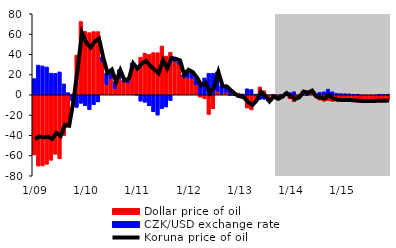
| Category | Dollar price of oil | CZK/USD exchange rate |
|---|---|---|
|  1/09 | -59.391 | 16.006 |
| 2 | -70.357 | 29.347 |
| 3 | -70.222 | 28.538 |
| 4 | -68.665 | 27.498 |
| 5 | -64.642 | 21.394 |
| 6 | -58.663 | 21.136 |
| 7 | -63.169 | 22.603 |
| 8 | -40.23 | 10.781 |
| 9 | -32.348 | 2.13 |
| 10 | 0.767 | -6.15 |
| 11 | 39.139 | -12.428 |
| 12 | 72.41 | -8.414 |
|  1/10 | 62.647 | -10.819 |
| 2 | 61.389 | -14.734 |
| 3 | 62.405 | -9.884 |
| 4 | 62.436 | -6.995 |
| 5 | 32.996 | 4.415 |
| 6 | 10.111 | 11.518 |
| 7 | 16.375 | 8.178 |
| 8 | 6.184 | 7.054 |
| 9 | 16.195 | 8.533 |
| 10 | 13.062 | 1.183 |
| 11 | 11.672 | 4.148 |
| 12 | 24.842 | 6.662 |
|  1/11 | 26.076 | -0.03 |
| 2 | 37.267 | -6.295 |
| 3 | 41.066 | -7.426 |
| 4 | 39.909 | -10.894 |
| 5 | 41.681 | -16.816 |
| 6 | 41.565 | -20.074 |
| 7 | 48.186 | -13.691 |
| 8 | 38.282 | -12.066 |
| 9 | 42.041 | -5.648 |
| 10 | 32.967 | 2.958 |
| 11 | 30.181 | 4.114 |
| 12 | 17.864 | 1.772 |
|  1/12 | 16.681 | 8.082 |
| 2 | 16.129 | 6.478 |
| 3 | 9.831 | 7.28 |
| 4 | -2.346 | 12.081 |
| 5 | -4.011 | 16.622 |
| 6 | -19.369 | 21.271 |
| 7 | -13.873 | 21.302 |
| 8 | 3.53 | 19.252 |
| 9 | 0.898 | 7.922 |
| 10 | 2.421 | 5.82 |
| 11 | -0.755 | 5.323 |
| 12 | 1.585 | -0.697 |
|  1/13 | 1.59 | -2.775 |
| 2 | -3.063 | 0.711 |
| 3 | -13.05 | 5.955 |
| 4 | -14.886 | 5.242 |
| 5 | -6.599 | 0.658 |
| 6 | 7.738 | -4.582 |
| 7 | 3.977 | -4.295 |
| 8 | -2.452 | -3.867 |
| 9 | -1.884 | 0.387 |
| 10 | -1.85 | -1.917 |
| 11 | 0.471 | -2.252 |
| 12 | -0.122 | 1.931 |
|  1/14 | -3.748 | 2.181 |
| 2 | -6.961 | 3.035 |
| 3 | -1.734 | -0.651 |
| 4 | 3.48 | -0.438 |
| 5 | 3.062 | -0.676 |
| 6 | 2.597 | 1.696 |
| 7 | -1.836 | 0.249 |
| 8 | -5.177 | 2.497 |
| 9 | -6.407 | 2.939 |
| 10 | -5.803 | 5.542 |
| 11 | -6.5 | 2.948 |
| 12 | -6.182 | 1.486 |
|  1/15 | -6.012 | 1.128 |
| 2 | -5.969 | 1.098 |
| 3 | -5.927 | 0.933 |
| 4 | -5.899 | 0.552 |
| 5 | -5.891 | 0.186 |
| 6 | -5.904 | -0.045 |
| 7 | -5.891 | -0.116 |
| 8 | -5.811 | -0.093 |
| 9 | -5.778 | -0.023 |
| 10 | -5.753 | 0.051 |
| 11 | -5.699 | 0.097 |
| 12 | -5.647 | 0.115 |